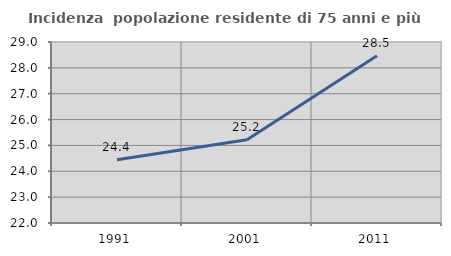
| Category | Incidenza  popolazione residente di 75 anni e più |
|---|---|
| 1991.0 | 24.444 |
| 2001.0 | 25.223 |
| 2011.0 | 28.467 |